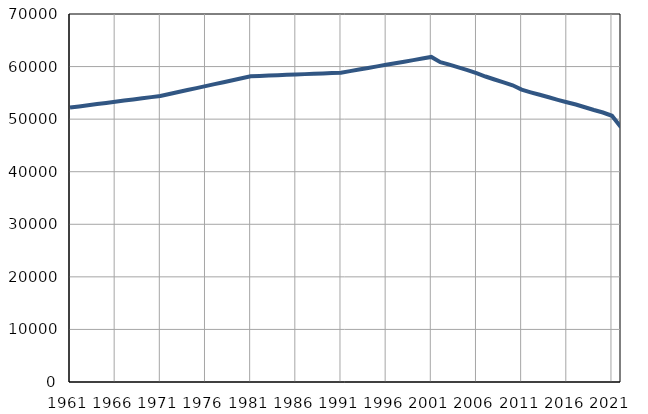
| Category | Population
size |
|---|---|
| 1961.0 | 52199 |
| 1962.0 | 52420 |
| 1963.0 | 52641 |
| 1964.0 | 52862 |
| 1965.0 | 53083 |
| 1966.0 | 53305 |
| 1967.0 | 53526 |
| 1968.0 | 53747 |
| 1969.0 | 53967 |
| 1970.0 | 54189 |
| 1971.0 | 54410 |
| 1972.0 | 54785 |
| 1973.0 | 55159 |
| 1974.0 | 55534 |
| 1975.0 | 55908 |
| 1976.0 | 56282 |
| 1977.0 | 56657 |
| 1978.0 | 57032 |
| 1979.0 | 57406 |
| 1980.0 | 57781 |
| 1981.0 | 58155 |
| 1982.0 | 58223 |
| 1983.0 | 58291 |
| 1984.0 | 58358 |
| 1985.0 | 58426 |
| 1986.0 | 58495 |
| 1987.0 | 58563 |
| 1988.0 | 58631 |
| 1989.0 | 58699 |
| 1990.0 | 58767 |
| 1991.0 | 58835 |
| 1992.0 | 59134 |
| 1993.0 | 59433 |
| 1994.0 | 59733 |
| 1995.0 | 60032 |
| 1996.0 | 60331 |
| 1997.0 | 60630 |
| 1998.0 | 60929 |
| 1999.0 | 61228 |
| 2000.0 | 61528 |
| 2001.0 | 61827 |
| 2002.0 | 60821 |
| 2003.0 | 60358 |
| 2004.0 | 59851 |
| 2005.0 | 59314 |
| 2006.0 | 58738 |
| 2007.0 | 58110 |
| 2008.0 | 57538 |
| 2009.0 | 57000 |
| 2010.0 | 56438 |
| 2011.0 | 55610 |
| 2012.0 | 55106 |
| 2013.0 | 54631 |
| 2014.0 | 54161 |
| 2015.0 | 53678 |
| 2016.0 | 53218 |
| 2017.0 | 52792 |
| 2018.0 | 52263 |
| 2019.0 | 51735 |
| 2020.0 | 51264 |
| 2021.0 | 50642 |
| 2022.0 | 48454 |